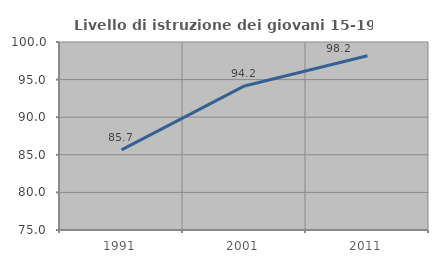
| Category | Livello di istruzione dei giovani 15-19 anni |
|---|---|
| 1991.0 | 85.651 |
| 2001.0 | 94.16 |
| 2011.0 | 98.168 |